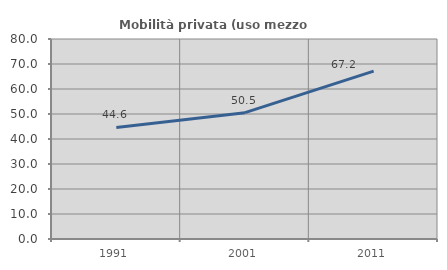
| Category | Mobilità privata (uso mezzo privato) |
|---|---|
| 1991.0 | 44.622 |
| 2001.0 | 50.535 |
| 2011.0 | 67.178 |